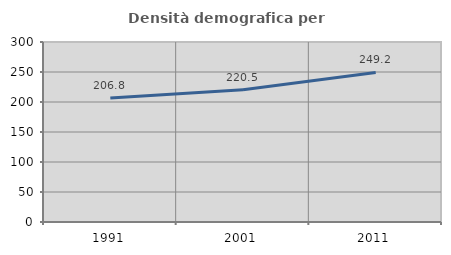
| Category | Densità demografica |
|---|---|
| 1991.0 | 206.81 |
| 2001.0 | 220.53 |
| 2011.0 | 249.171 |